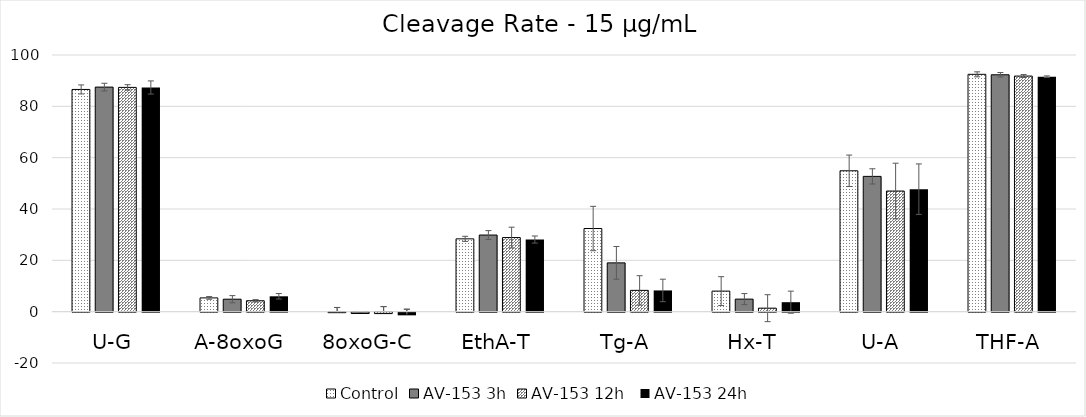
| Category | Control | AV-153 3h | AV-153 12h  | AV-153 24h  |
|---|---|---|---|---|
| U-G | 86.579 | 87.493 | 87.375 | 87.342 |
| A-8oxoG | 5.365 | 4.862 | 4.255 | 5.989 |
| 8oxoG-C | -0.201 | -0.515 | -0.544 | -1.038 |
| EthA-T | 28.369 | 29.856 | 28.876 | 28.106 |
| Tg-A | 32.394 | 19.015 | 8.298 | 8.273 |
| Hx-T | 8.006 | 4.892 | 1.362 | 3.694 |
| U-A | 54.889 | 52.71 | 46.995 | 47.733 |
| THF-A | 92.47 | 92.289 | 91.795 | 91.541 |